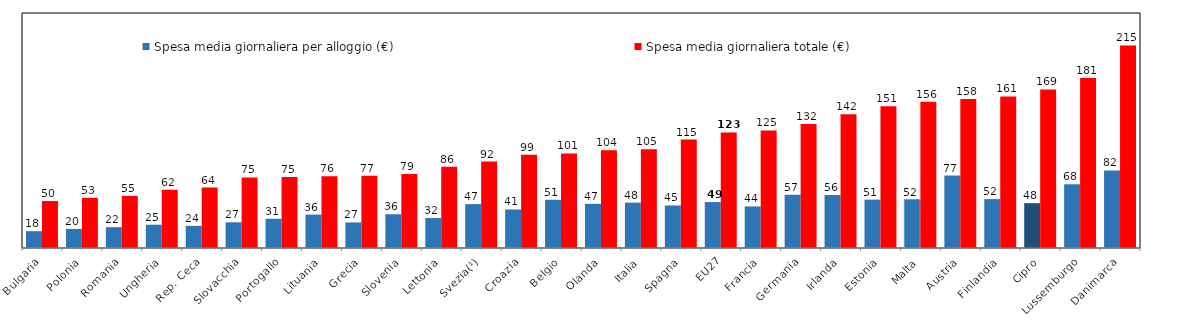
| Category | Spesa media giornaliera per alloggio (€) | Spesa media giornaliera totale (€) |
|---|---|---|
| Bulgaria | 17.889 | 49.964 |
| Polonia | 20.272 | 53.387 |
| Romania | 22.113 | 55.37 |
| Ungheria | 24.787 | 62.036 |
| Rep. Ceca | 23.515 | 64.344 |
| Slovacchia | 27.337 | 75.087 |
| Portogallo | 31.118 | 75.486 |
| Lituania | 35.508 | 76.233 |
| Grecia | 27.192 | 76.817 |
| Slovenia | 35.916 | 78.81 |
| Lettonia | 31.878 | 86.328 |
| Svezia(¹) | 46.673 | 91.949 |
| Croazia | 40.986 | 99.177 |
| Belgio | 51.298 | 100.65 |
| Olanda | 46.957 | 104.109 |
| Italia | 48.261 | 105.047 |
| Spagna | 45.22 | 115.348 |
| EU27 | 48.852 | 122.968 |
| Francia | 44.203 | 125.03 |
| Germania | 56.528 | 132.01 |
| Irlanda | 56.371 | 142.336 |
| Estonia | 51.451 | 150.715 |
| Malta | 51.519 | 155.619 |
| Austria | 77.066 | 158.441 |
| Finlandia | 52.017 | 161.286 |
| Cipro | 47.717 | 168.72 |
| Lussemburgo | 67.743 | 180.857 |
| Danimarca | 82.478 | 215.482 |